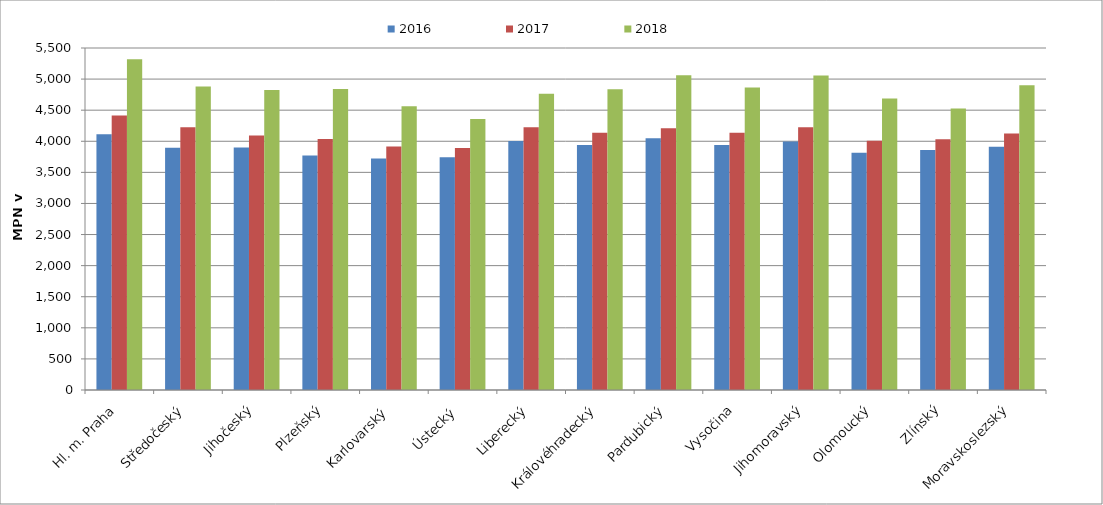
| Category | 2016 | 2017 | 2018 |
|---|---|---|---|
| Hl. m. Praha | 4114.848 | 4413.454 | 5319.114 |
| Středočeský | 3895.051 | 4223.772 | 4879.601 |
| Jihočeský | 3898.318 | 4093.304 | 4826.015 |
| Plzeňský | 3771.387 | 4035.328 | 4842.336 |
| Karlovarský  | 3721.522 | 3915.689 | 4562.91 |
| Ústecký   | 3744.128 | 3893.8 | 4356.624 |
| Liberecký | 4003.287 | 4224.529 | 4762.685 |
| Královéhradecký | 3938.486 | 4135.266 | 4838.325 |
| Pardubický | 4048.544 | 4210.68 | 5060.518 |
| Vysočina | 3938.581 | 4135.477 | 4863.525 |
| Jihomoravský | 3998.334 | 4226.712 | 5058.058 |
| Olomoucký | 3815.723 | 4006.654 | 4687.631 |
| Zlínský | 3860.819 | 4032.284 | 4525.885 |
| Moravskoslezský | 3910.899 | 4124.105 | 4900.557 |